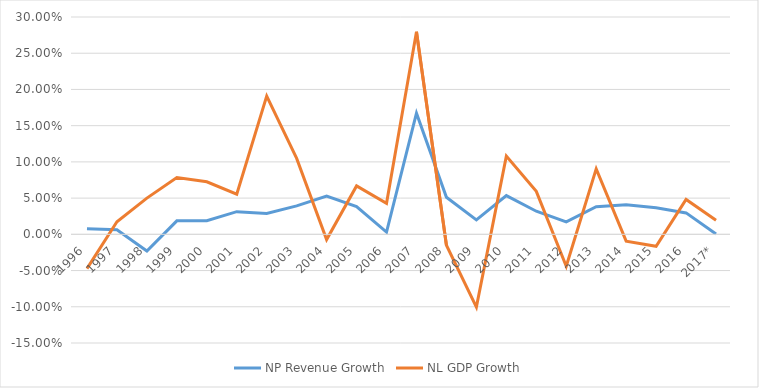
| Category | NP Revenue Growth | NL GDP Growth |
|---|---|---|
| 1996 | 0.008 | -0.047 |
| 1997 | 0.006 | 0.011 |
| 1998 | -0.023 | 0.05 |
| 1999 | 0.019 | 0.06 |
| 2000 | 0.019 | 0.054 |
| 2001 | 0.031 | 0.024 |
| 2002 | 0.029 | 0.162 |
| 2003 | 0.039 | 0.066 |
| 2004 | 0.053 | -0.007 |
| 2005 | 0.038 | 0.028 |
| 2006 | 0.003 | 0.04 |
| 2007 | 0.167 | 0.112 |
| 2008 | 0.051 | -0.015 |
| 2009 | 0.02 | -0.101 |
| 2010 | 0.053 | 0.055 |
| 2011 | 0.032 | 0.027 |
| 2012 | 0.017 | -0.044 |
| 2013 | 0.038 | 0.052 |
| 2014 | 0.041 | -0.009 |
| 2015 | 0.037 | -0.017 |
| 2016 | 0.03 | 0.019 |
| 2017* | 0 | 0.019 |